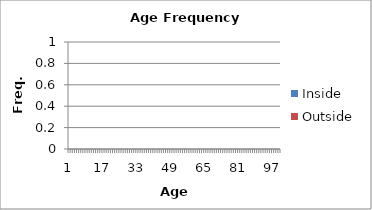
| Category | Inside | Outside |
|---|---|---|
| 0 | 0 | 0 |
| 1 | 0 | 0 |
| 2 | 0 | 0 |
| 3 | 0 | 0 |
| 4 | 0 | 0 |
| 5 | 0 | 0 |
| 6 | 0 | 0 |
| 7 | 0 | 0 |
| 8 | 0 | 0 |
| 9 | 0 | 0 |
| 10 | 0 | 0 |
| 11 | 0 | 0 |
| 12 | 0 | 0 |
| 13 | 0 | 0 |
| 14 | 0 | 0 |
| 15 | 0 | 0 |
| 16 | 0 | 0 |
| 17 | 0 | 0 |
| 18 | 0 | 0 |
| 19 | 0 | 0 |
| 20 | 0 | 0 |
| 21 | 0 | 0 |
| 22 | 0 | 0 |
| 23 | 0 | 0 |
| 24 | 0 | 0 |
| 25 | 0 | 0 |
| 26 | 0 | 0 |
| 27 | 0 | 0 |
| 28 | 0 | 0 |
| 29 | 0 | 0 |
| 30 | 0 | 0 |
| 31 | 0 | 0 |
| 32 | 0 | 0 |
| 33 | 0 | 0 |
| 34 | 0 | 0 |
| 35 | 0 | 0 |
| 36 | 0 | 0 |
| 37 | 0 | 0 |
| 38 | 0 | 0 |
| 39 | 0 | 0 |
| 40 | 0 | 0 |
| 41 | 0 | 0 |
| 42 | 0 | 0 |
| 43 | 0 | 0 |
| 44 | 0 | 0 |
| 45 | 0 | 0 |
| 46 | 0 | 0 |
| 47 | 0 | 0 |
| 48 | 0 | 0 |
| 49 | 0 | 0 |
| 50 | 0 | 0 |
| 51 | 0 | 0 |
| 52 | 0 | 0 |
| 53 | 0 | 0 |
| 54 | 0 | 0 |
| 55 | 0 | 0 |
| 56 | 0 | 0 |
| 57 | 0 | 0 |
| 58 | 0 | 0 |
| 59 | 0 | 0 |
| 60 | 0 | 0 |
| 61 | 0 | 0 |
| 62 | 0 | 0 |
| 63 | 0 | 0 |
| 64 | 0 | 0 |
| 65 | 0 | 0 |
| 66 | 0 | 0 |
| 67 | 0 | 0 |
| 68 | 0 | 0 |
| 69 | 0 | 0 |
| 70 | 0 | 0 |
| 71 | 0 | 0 |
| 72 | 0 | 0 |
| 73 | 0 | 0 |
| 74 | 0 | 0 |
| 75 | 0 | 0 |
| 76 | 0 | 0 |
| 77 | 0 | 0 |
| 78 | 0 | 0 |
| 79 | 0 | 0 |
| 80 | 0 | 0 |
| 81 | 0 | 0 |
| 82 | 0 | 0 |
| 83 | 0 | 0 |
| 84 | 0 | 0 |
| 85 | 0 | 0 |
| 86 | 0 | 0 |
| 87 | 0 | 0 |
| 88 | 0 | 0 |
| 89 | 0 | 0 |
| 90 | 0 | 0 |
| 91 | 0 | 0 |
| 92 | 0 | 0 |
| 93 | 0 | 0 |
| 94 | 0 | 0 |
| 95 | 0 | 0 |
| 96 | 0 | 0 |
| 97 | 0 | 0 |
| 98 | 0 | 0 |
| 99 | 0 | 0 |